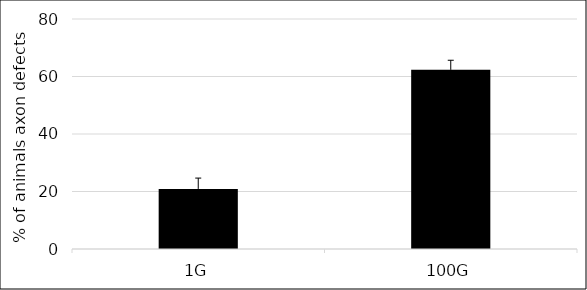
| Category | defect |
|---|---|
| 1G | 20.91 |
| 100G | 62.364 |